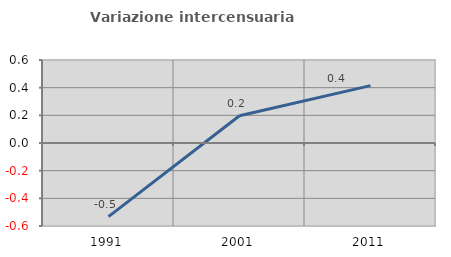
| Category | Variazione intercensuaria annua |
|---|---|
| 1991.0 | -0.532 |
| 2001.0 | 0.197 |
| 2011.0 | 0.415 |